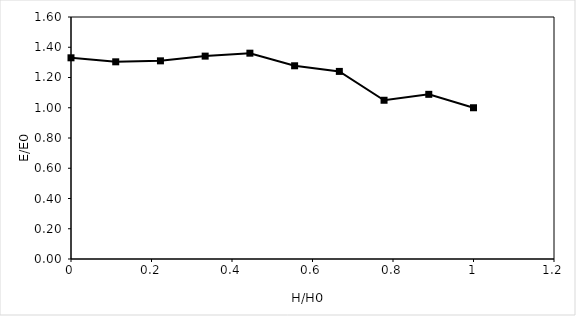
| Category | Head (feet) |
|---|---|
| 1.0 | 1 |
| 0.8888888888888888 | 1.089 |
| 0.7777777777777778 | 1.05 |
| 0.6666666666666666 | 1.24 |
| 0.5555555555555556 | 1.277 |
| 0.4444444444444444 | 1.361 |
| 0.3333333333333333 | 1.341 |
| 0.2222222222222222 | 1.31 |
| 0.1111111111111111 | 1.304 |
| 0.0 | 1.33 |